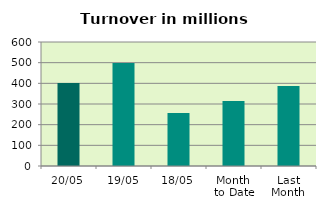
| Category | Series 0 |
|---|---|
| 20/05 | 401.084 |
| 19/05 | 498.553 |
| 18/05 | 256.332 |
| Month 
to Date | 314.875 |
| Last
Month | 387.046 |